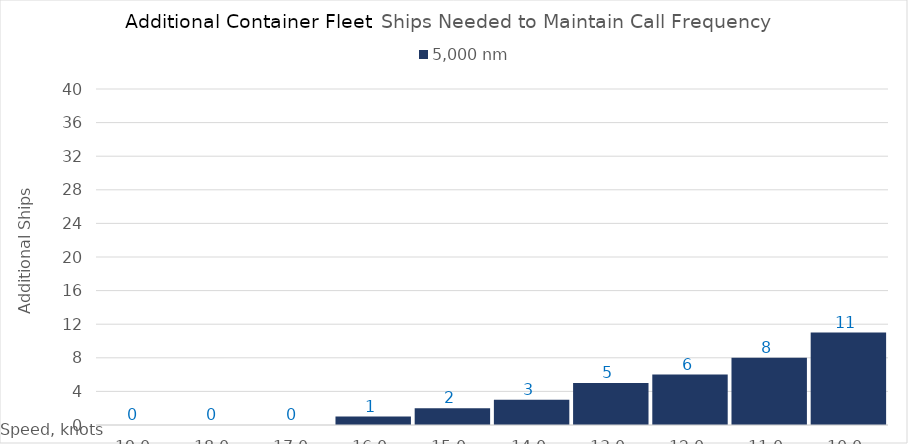
| Category | 5,000 |
|---|---|
| 19.0 | 0 |
| 18.0 | 0 |
| 17.0 | 0 |
| 16.0 | 1 |
| 15.0 | 2 |
| 14.0 | 3 |
| 13.0 | 5 |
| 12.0 | 6 |
| 11.0 | 8 |
| 10.0 | 11 |